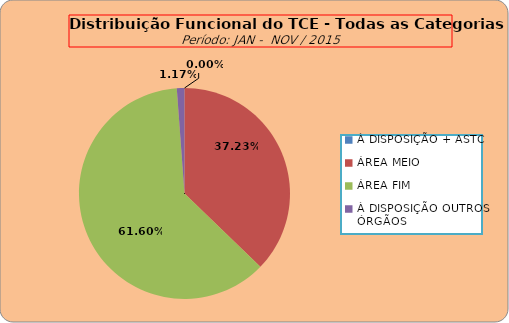
| Category | Series 0 |
|---|---|
| À DISPOSIÇÃO + ASTC | 0 |
| ÁREA MEIO | 191 |
| ÁREA FIM | 316 |
| À DISPOSIÇÃO OUTROS ÓRGÃOS | 6 |